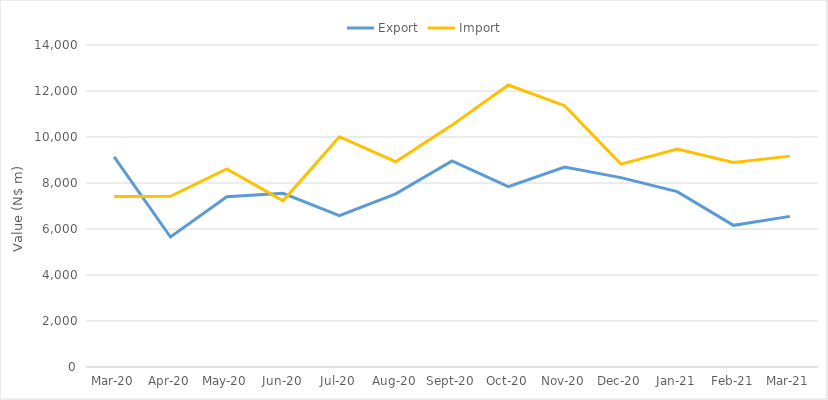
| Category | Export | Import |
|---|---|---|
| 2020-03-01 | 9135.924 | 7407.82 |
| 2020-04-01 | 5652.681 | 7419.971 |
| 2020-05-01 | 7405.105 | 8613.109 |
| 2020-06-01 | 7550.744 | 7225.655 |
| 2020-07-01 | 6582.778 | 10011.055 |
| 2020-08-01 | 7530.921 | 8926.715 |
| 2020-09-01 | 8956.329 | 10517.39 |
| 2020-10-01 | 7839.288 | 12260.252 |
| 2020-11-01 | 8692.896 | 11361.754 |
| 2020-12-01 | 8235.063 | 8820.825 |
| 2021-01-01 | 7626.274 | 9480.486 |
| 2021-02-01 | 6159.741 | 8890.181 |
| 2021-03-01 | 6548.408 | 9168.198 |